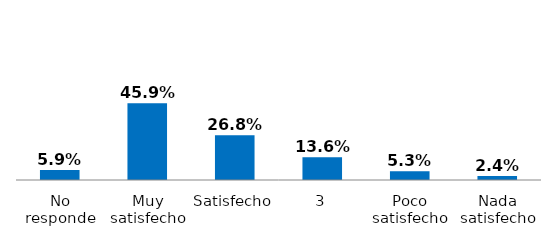
| Category | Series 0 |
|---|---|
| Nada satisfecho | 0.024 |
| Poco satisfecho | 0.053 |
| 3 | 0.136 |
| Satisfecho | 0.268 |
| Muy satisfecho | 0.459 |
| No responde | 0.059 |